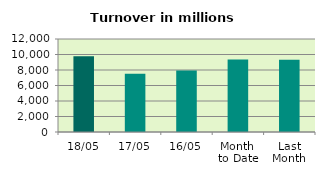
| Category | Series 0 |
|---|---|
| 18/05 | 9771.201 |
| 17/05 | 7508.966 |
| 16/05 | 7946.097 |
| Month 
to Date | 9355.6 |
| Last
Month | 9311.354 |